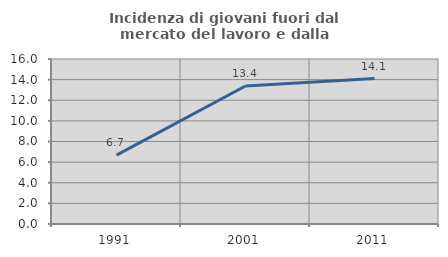
| Category | Incidenza di giovani fuori dal mercato del lavoro e dalla formazione  |
|---|---|
| 1991.0 | 6.678 |
| 2001.0 | 13.377 |
| 2011.0 | 14.106 |